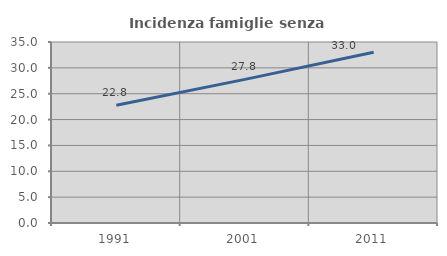
| Category | Incidenza famiglie senza nuclei |
|---|---|
| 1991.0 | 22.777 |
| 2001.0 | 27.774 |
| 2011.0 | 33.034 |